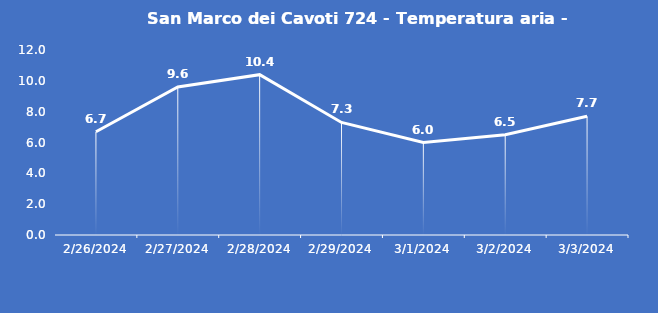
| Category | San Marco dei Cavoti 724 - Temperatura aria - Grezzo (°C) |
|---|---|
| 2/26/24 | 6.7 |
| 2/27/24 | 9.6 |
| 2/28/24 | 10.4 |
| 2/29/24 | 7.3 |
| 3/1/24 | 6 |
| 3/2/24 | 6.5 |
| 3/3/24 | 7.7 |